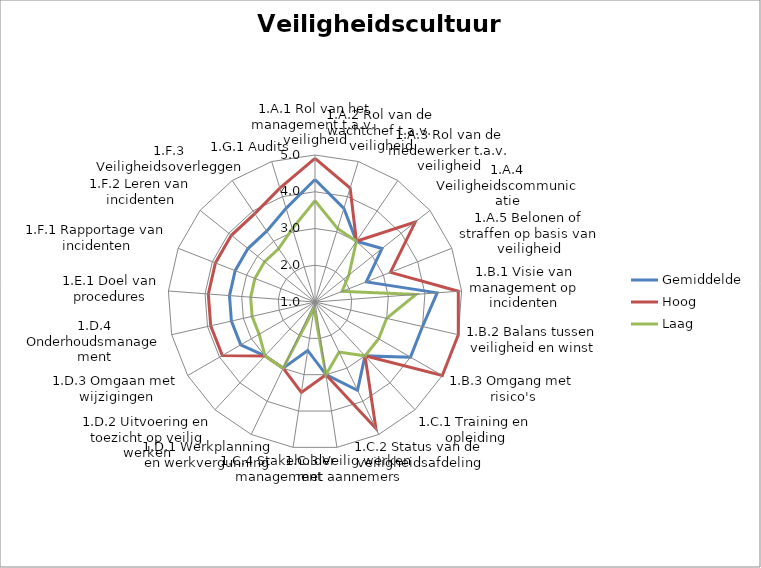
| Category | Gemiddelde | Hoog | Laag |
|---|---|---|---|
| 1.A.1 Rol van het management t.a.v. veiligheid | 4.333 | 4.911 | 3.756 |
| 1.A.2 Rol van de wachtchef t.a.v. veiligheid | 3.667 | 4.244 | 3.089 |
| 1.A.3 Rol van de medewerker t.a.v. veiligheid | 3 | 3 | 3 |
| 1.A.4 Veiligheidscommunicatie | 3.333 | 4.488 | 2.179 |
| 1.A.5 Belonen of straffen op basis van veiligheid | 2.5 | 3.207 | 1.793 |
| 1.B.1 Visie van management op incidenten | 4.333 | 4.911 | 3.756 |
| 1.B.2 Balans tussen veiligheid en winst | 4 | 5 | 3 |
| 1.B.3 Omgang met risico's | 4 | 5 | 3 |
| 1.C.1 Training en opleiding | 3 | 3 | 3 |
| 1.C.2 Status van de veiligheidsafdeling | 3.667 | 4.821 | 2.512 |
| 1.C.3 Veilig werken met aannemers | 3 | 3 | 3 |
| 1.C.4 Stakeholder management | 2.333 | 3.488 | 1.179 |
| 1.D.1 Werkplanning en werkvergunning | 3 | 3 | 3 |
| 1.D.2 Uitvoering en toezicht op veilig werken | 3 | 3 | 3 |
| 1.D.3 Omgaan met wijzigingen | 3.333 | 3.911 | 2.756 |
| 1.D.4 Onderhoudsmanagement | 3.333 | 3.911 | 2.756 |
| 1.E.1 Doel van procedures | 3.333 | 3.911 | 2.756 |
| 1.F.1 Rapportage van incidenten | 3.333 | 3.911 | 2.756 |
| 1.F.2 Leren van incidenten | 3.333 | 3.911 | 2.756 |
| 1.F.3 Veiligheidsoverleggen | 3.333 | 3.911 | 2.756 |
| 1.G.1 Audits | 3.667 | 4.244 | 3.089 |